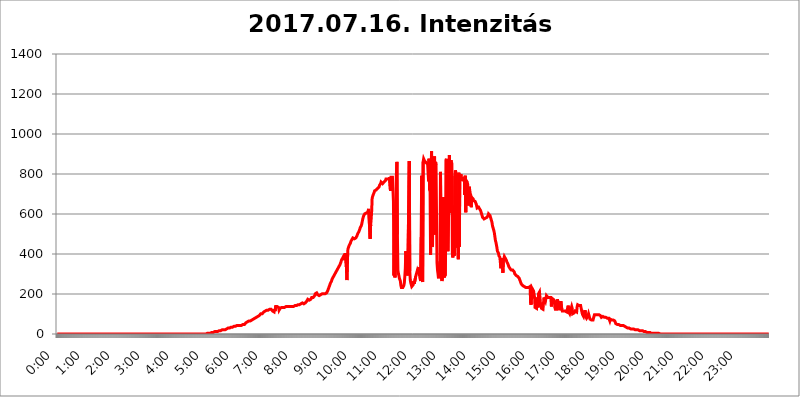
| Category | 2017.07.16. Intenzitás [W/m^2]04 |
|---|---|
| 0.0 | 0 |
| 0.0006944444444444445 | 0 |
| 0.001388888888888889 | 0 |
| 0.0020833333333333333 | 0 |
| 0.002777777777777778 | 0 |
| 0.003472222222222222 | 0 |
| 0.004166666666666667 | 0 |
| 0.004861111111111111 | 0 |
| 0.005555555555555556 | 0 |
| 0.0062499999999999995 | 0 |
| 0.006944444444444444 | 0 |
| 0.007638888888888889 | 0 |
| 0.008333333333333333 | 0 |
| 0.009027777777777779 | 0 |
| 0.009722222222222222 | 0 |
| 0.010416666666666666 | 0 |
| 0.011111111111111112 | 0 |
| 0.011805555555555555 | 0 |
| 0.012499999999999999 | 0 |
| 0.013194444444444444 | 0 |
| 0.013888888888888888 | 0 |
| 0.014583333333333332 | 0 |
| 0.015277777777777777 | 0 |
| 0.015972222222222224 | 0 |
| 0.016666666666666666 | 0 |
| 0.017361111111111112 | 0 |
| 0.018055555555555557 | 0 |
| 0.01875 | 0 |
| 0.019444444444444445 | 0 |
| 0.02013888888888889 | 0 |
| 0.020833333333333332 | 0 |
| 0.02152777777777778 | 0 |
| 0.022222222222222223 | 0 |
| 0.02291666666666667 | 0 |
| 0.02361111111111111 | 0 |
| 0.024305555555555556 | 0 |
| 0.024999999999999998 | 0 |
| 0.025694444444444447 | 0 |
| 0.02638888888888889 | 0 |
| 0.027083333333333334 | 0 |
| 0.027777777777777776 | 0 |
| 0.02847222222222222 | 0 |
| 0.029166666666666664 | 0 |
| 0.029861111111111113 | 0 |
| 0.030555555555555555 | 0 |
| 0.03125 | 0 |
| 0.03194444444444445 | 0 |
| 0.03263888888888889 | 0 |
| 0.03333333333333333 | 0 |
| 0.034027777777777775 | 0 |
| 0.034722222222222224 | 0 |
| 0.035416666666666666 | 0 |
| 0.036111111111111115 | 0 |
| 0.03680555555555556 | 0 |
| 0.0375 | 0 |
| 0.03819444444444444 | 0 |
| 0.03888888888888889 | 0 |
| 0.03958333333333333 | 0 |
| 0.04027777777777778 | 0 |
| 0.04097222222222222 | 0 |
| 0.041666666666666664 | 0 |
| 0.042361111111111106 | 0 |
| 0.04305555555555556 | 0 |
| 0.043750000000000004 | 0 |
| 0.044444444444444446 | 0 |
| 0.04513888888888889 | 0 |
| 0.04583333333333334 | 0 |
| 0.04652777777777778 | 0 |
| 0.04722222222222222 | 0 |
| 0.04791666666666666 | 0 |
| 0.04861111111111111 | 0 |
| 0.049305555555555554 | 0 |
| 0.049999999999999996 | 0 |
| 0.05069444444444445 | 0 |
| 0.051388888888888894 | 0 |
| 0.052083333333333336 | 0 |
| 0.05277777777777778 | 0 |
| 0.05347222222222222 | 0 |
| 0.05416666666666667 | 0 |
| 0.05486111111111111 | 0 |
| 0.05555555555555555 | 0 |
| 0.05625 | 0 |
| 0.05694444444444444 | 0 |
| 0.057638888888888885 | 0 |
| 0.05833333333333333 | 0 |
| 0.05902777777777778 | 0 |
| 0.059722222222222225 | 0 |
| 0.06041666666666667 | 0 |
| 0.061111111111111116 | 0 |
| 0.06180555555555556 | 0 |
| 0.0625 | 0 |
| 0.06319444444444444 | 0 |
| 0.06388888888888888 | 0 |
| 0.06458333333333334 | 0 |
| 0.06527777777777778 | 0 |
| 0.06597222222222222 | 0 |
| 0.06666666666666667 | 0 |
| 0.06736111111111111 | 0 |
| 0.06805555555555555 | 0 |
| 0.06874999999999999 | 0 |
| 0.06944444444444443 | 0 |
| 0.07013888888888889 | 0 |
| 0.07083333333333333 | 0 |
| 0.07152777777777779 | 0 |
| 0.07222222222222223 | 0 |
| 0.07291666666666667 | 0 |
| 0.07361111111111111 | 0 |
| 0.07430555555555556 | 0 |
| 0.075 | 0 |
| 0.07569444444444444 | 0 |
| 0.0763888888888889 | 0 |
| 0.07708333333333334 | 0 |
| 0.07777777777777778 | 0 |
| 0.07847222222222222 | 0 |
| 0.07916666666666666 | 0 |
| 0.0798611111111111 | 0 |
| 0.08055555555555556 | 0 |
| 0.08125 | 0 |
| 0.08194444444444444 | 0 |
| 0.08263888888888889 | 0 |
| 0.08333333333333333 | 0 |
| 0.08402777777777777 | 0 |
| 0.08472222222222221 | 0 |
| 0.08541666666666665 | 0 |
| 0.08611111111111112 | 0 |
| 0.08680555555555557 | 0 |
| 0.08750000000000001 | 0 |
| 0.08819444444444445 | 0 |
| 0.08888888888888889 | 0 |
| 0.08958333333333333 | 0 |
| 0.09027777777777778 | 0 |
| 0.09097222222222222 | 0 |
| 0.09166666666666667 | 0 |
| 0.09236111111111112 | 0 |
| 0.09305555555555556 | 0 |
| 0.09375 | 0 |
| 0.09444444444444444 | 0 |
| 0.09513888888888888 | 0 |
| 0.09583333333333333 | 0 |
| 0.09652777777777777 | 0 |
| 0.09722222222222222 | 0 |
| 0.09791666666666667 | 0 |
| 0.09861111111111111 | 0 |
| 0.09930555555555555 | 0 |
| 0.09999999999999999 | 0 |
| 0.10069444444444443 | 0 |
| 0.1013888888888889 | 0 |
| 0.10208333333333335 | 0 |
| 0.10277777777777779 | 0 |
| 0.10347222222222223 | 0 |
| 0.10416666666666667 | 0 |
| 0.10486111111111111 | 0 |
| 0.10555555555555556 | 0 |
| 0.10625 | 0 |
| 0.10694444444444444 | 0 |
| 0.1076388888888889 | 0 |
| 0.10833333333333334 | 0 |
| 0.10902777777777778 | 0 |
| 0.10972222222222222 | 0 |
| 0.1111111111111111 | 0 |
| 0.11180555555555556 | 0 |
| 0.11180555555555556 | 0 |
| 0.1125 | 0 |
| 0.11319444444444444 | 0 |
| 0.11388888888888889 | 0 |
| 0.11458333333333333 | 0 |
| 0.11527777777777777 | 0 |
| 0.11597222222222221 | 0 |
| 0.11666666666666665 | 0 |
| 0.1173611111111111 | 0 |
| 0.11805555555555557 | 0 |
| 0.11944444444444445 | 0 |
| 0.12013888888888889 | 0 |
| 0.12083333333333333 | 0 |
| 0.12152777777777778 | 0 |
| 0.12222222222222223 | 0 |
| 0.12291666666666667 | 0 |
| 0.12291666666666667 | 0 |
| 0.12361111111111112 | 0 |
| 0.12430555555555556 | 0 |
| 0.125 | 0 |
| 0.12569444444444444 | 0 |
| 0.12638888888888888 | 0 |
| 0.12708333333333333 | 0 |
| 0.16875 | 0 |
| 0.12847222222222224 | 0 |
| 0.12916666666666668 | 0 |
| 0.12986111111111112 | 0 |
| 0.13055555555555556 | 0 |
| 0.13125 | 0 |
| 0.13194444444444445 | 0 |
| 0.1326388888888889 | 0 |
| 0.13333333333333333 | 0 |
| 0.13402777777777777 | 0 |
| 0.13402777777777777 | 0 |
| 0.13472222222222222 | 0 |
| 0.13541666666666666 | 0 |
| 0.1361111111111111 | 0 |
| 0.13749999999999998 | 0 |
| 0.13819444444444443 | 0 |
| 0.1388888888888889 | 0 |
| 0.13958333333333334 | 0 |
| 0.14027777777777778 | 0 |
| 0.14097222222222222 | 0 |
| 0.14166666666666666 | 0 |
| 0.1423611111111111 | 0 |
| 0.14305555555555557 | 0 |
| 0.14375000000000002 | 0 |
| 0.14444444444444446 | 0 |
| 0.1451388888888889 | 0 |
| 0.1451388888888889 | 0 |
| 0.14652777777777778 | 0 |
| 0.14722222222222223 | 0 |
| 0.14791666666666667 | 0 |
| 0.1486111111111111 | 0 |
| 0.14930555555555555 | 0 |
| 0.15 | 0 |
| 0.15069444444444444 | 0 |
| 0.15138888888888888 | 0 |
| 0.15208333333333332 | 0 |
| 0.15277777777777776 | 0 |
| 0.15347222222222223 | 0 |
| 0.15416666666666667 | 0 |
| 0.15486111111111112 | 0 |
| 0.15555555555555556 | 0 |
| 0.15625 | 0 |
| 0.15694444444444444 | 0 |
| 0.15763888888888888 | 0 |
| 0.15833333333333333 | 0 |
| 0.15902777777777777 | 0 |
| 0.15972222222222224 | 0 |
| 0.16041666666666668 | 0 |
| 0.16111111111111112 | 0 |
| 0.16180555555555556 | 0 |
| 0.1625 | 0 |
| 0.16319444444444445 | 0 |
| 0.1638888888888889 | 0 |
| 0.16458333333333333 | 0 |
| 0.16527777777777777 | 0 |
| 0.16597222222222222 | 0 |
| 0.16666666666666666 | 0 |
| 0.1673611111111111 | 0 |
| 0.16805555555555554 | 0 |
| 0.16874999999999998 | 0 |
| 0.16944444444444443 | 0 |
| 0.17013888888888887 | 0 |
| 0.1708333333333333 | 0 |
| 0.17152777777777775 | 0 |
| 0.17222222222222225 | 0 |
| 0.1729166666666667 | 0 |
| 0.17361111111111113 | 0 |
| 0.17430555555555557 | 0 |
| 0.17500000000000002 | 0 |
| 0.17569444444444446 | 0 |
| 0.1763888888888889 | 0 |
| 0.17708333333333334 | 0 |
| 0.17777777777777778 | 0 |
| 0.17847222222222223 | 0 |
| 0.17916666666666667 | 0 |
| 0.1798611111111111 | 0 |
| 0.18055555555555555 | 0 |
| 0.18125 | 0 |
| 0.18194444444444444 | 0 |
| 0.1826388888888889 | 0 |
| 0.18333333333333335 | 0 |
| 0.1840277777777778 | 0 |
| 0.18472222222222223 | 0 |
| 0.18541666666666667 | 0 |
| 0.18611111111111112 | 0 |
| 0.18680555555555556 | 0 |
| 0.1875 | 0 |
| 0.18819444444444444 | 0 |
| 0.18888888888888888 | 0 |
| 0.18958333333333333 | 0 |
| 0.19027777777777777 | 0 |
| 0.1909722222222222 | 0 |
| 0.19166666666666665 | 0 |
| 0.19236111111111112 | 0 |
| 0.19305555555555554 | 0 |
| 0.19375 | 0 |
| 0.19444444444444445 | 0 |
| 0.1951388888888889 | 0 |
| 0.19583333333333333 | 0 |
| 0.19652777777777777 | 0 |
| 0.19722222222222222 | 0 |
| 0.19791666666666666 | 0 |
| 0.1986111111111111 | 0 |
| 0.19930555555555554 | 0 |
| 0.19999999999999998 | 0 |
| 0.20069444444444443 | 0 |
| 0.20138888888888887 | 0 |
| 0.2020833333333333 | 0 |
| 0.2027777777777778 | 0 |
| 0.2034722222222222 | 0 |
| 0.2041666666666667 | 0 |
| 0.20486111111111113 | 0 |
| 0.20555555555555557 | 0 |
| 0.20625000000000002 | 0 |
| 0.20694444444444446 | 0 |
| 0.2076388888888889 | 0 |
| 0.20833333333333334 | 0 |
| 0.20902777777777778 | 3.525 |
| 0.20972222222222223 | 3.525 |
| 0.21041666666666667 | 3.525 |
| 0.2111111111111111 | 3.525 |
| 0.21180555555555555 | 3.525 |
| 0.2125 | 3.525 |
| 0.21319444444444444 | 3.525 |
| 0.2138888888888889 | 3.525 |
| 0.21458333333333335 | 3.525 |
| 0.2152777777777778 | 3.525 |
| 0.21597222222222223 | 3.525 |
| 0.21666666666666667 | 7.887 |
| 0.21736111111111112 | 7.887 |
| 0.21805555555555556 | 7.887 |
| 0.21875 | 7.887 |
| 0.21944444444444444 | 7.887 |
| 0.22013888888888888 | 7.887 |
| 0.22083333333333333 | 12.257 |
| 0.22152777777777777 | 12.257 |
| 0.2222222222222222 | 12.257 |
| 0.22291666666666665 | 12.257 |
| 0.2236111111111111 | 12.257 |
| 0.22430555555555556 | 12.257 |
| 0.225 | 12.257 |
| 0.22569444444444445 | 12.257 |
| 0.2263888888888889 | 12.257 |
| 0.22708333333333333 | 16.636 |
| 0.22777777777777777 | 16.636 |
| 0.22847222222222222 | 16.636 |
| 0.22916666666666666 | 16.636 |
| 0.2298611111111111 | 16.636 |
| 0.23055555555555554 | 16.636 |
| 0.23124999999999998 | 21.024 |
| 0.23194444444444443 | 21.024 |
| 0.23263888888888887 | 21.024 |
| 0.2333333333333333 | 21.024 |
| 0.2340277777777778 | 21.024 |
| 0.2347222222222222 | 21.024 |
| 0.2354166666666667 | 21.024 |
| 0.23611111111111113 | 21.024 |
| 0.23680555555555557 | 21.024 |
| 0.23750000000000002 | 25.419 |
| 0.23819444444444446 | 25.419 |
| 0.2388888888888889 | 25.419 |
| 0.23958333333333334 | 29.823 |
| 0.24027777777777778 | 29.823 |
| 0.24097222222222223 | 29.823 |
| 0.24166666666666667 | 29.823 |
| 0.2423611111111111 | 34.234 |
| 0.24305555555555555 | 34.234 |
| 0.24375 | 34.234 |
| 0.24444444444444446 | 34.234 |
| 0.24513888888888888 | 34.234 |
| 0.24583333333333335 | 34.234 |
| 0.2465277777777778 | 38.653 |
| 0.24722222222222223 | 38.653 |
| 0.24791666666666667 | 38.653 |
| 0.24861111111111112 | 38.653 |
| 0.24930555555555556 | 38.653 |
| 0.25 | 38.653 |
| 0.25069444444444444 | 43.079 |
| 0.2513888888888889 | 43.079 |
| 0.2520833333333333 | 43.079 |
| 0.25277777777777777 | 43.079 |
| 0.2534722222222222 | 43.079 |
| 0.25416666666666665 | 43.079 |
| 0.2548611111111111 | 43.079 |
| 0.2555555555555556 | 43.079 |
| 0.25625000000000003 | 43.079 |
| 0.2569444444444445 | 43.079 |
| 0.2576388888888889 | 43.079 |
| 0.25833333333333336 | 43.079 |
| 0.2590277777777778 | 47.511 |
| 0.25972222222222224 | 47.511 |
| 0.2604166666666667 | 47.511 |
| 0.2611111111111111 | 47.511 |
| 0.26180555555555557 | 47.511 |
| 0.2625 | 47.511 |
| 0.26319444444444445 | 51.951 |
| 0.2638888888888889 | 51.951 |
| 0.26458333333333334 | 56.398 |
| 0.2652777777777778 | 56.398 |
| 0.2659722222222222 | 60.85 |
| 0.26666666666666666 | 60.85 |
| 0.2673611111111111 | 65.31 |
| 0.26805555555555555 | 65.31 |
| 0.26875 | 65.31 |
| 0.26944444444444443 | 65.31 |
| 0.2701388888888889 | 65.31 |
| 0.2708333333333333 | 65.31 |
| 0.27152777777777776 | 65.31 |
| 0.2722222222222222 | 69.775 |
| 0.27291666666666664 | 69.775 |
| 0.2736111111111111 | 69.775 |
| 0.2743055555555555 | 74.246 |
| 0.27499999999999997 | 74.246 |
| 0.27569444444444446 | 74.246 |
| 0.27638888888888885 | 78.722 |
| 0.27708333333333335 | 78.722 |
| 0.2777777777777778 | 78.722 |
| 0.27847222222222223 | 83.205 |
| 0.2791666666666667 | 83.205 |
| 0.2798611111111111 | 83.205 |
| 0.28055555555555556 | 83.205 |
| 0.28125 | 87.692 |
| 0.28194444444444444 | 92.184 |
| 0.2826388888888889 | 92.184 |
| 0.2833333333333333 | 92.184 |
| 0.28402777777777777 | 96.682 |
| 0.2847222222222222 | 96.682 |
| 0.28541666666666665 | 101.184 |
| 0.28611111111111115 | 101.184 |
| 0.28680555555555554 | 101.184 |
| 0.28750000000000003 | 101.184 |
| 0.2881944444444445 | 101.184 |
| 0.2888888888888889 | 105.69 |
| 0.28958333333333336 | 110.201 |
| 0.2902777777777778 | 110.201 |
| 0.29097222222222224 | 110.201 |
| 0.2916666666666667 | 114.716 |
| 0.2923611111111111 | 114.716 |
| 0.29305555555555557 | 119.235 |
| 0.29375 | 119.235 |
| 0.29444444444444445 | 119.235 |
| 0.2951388888888889 | 119.235 |
| 0.29583333333333334 | 119.235 |
| 0.2965277777777778 | 123.758 |
| 0.2972222222222222 | 119.235 |
| 0.29791666666666666 | 123.758 |
| 0.2986111111111111 | 123.758 |
| 0.29930555555555555 | 123.758 |
| 0.3 | 123.758 |
| 0.30069444444444443 | 123.758 |
| 0.3013888888888889 | 119.235 |
| 0.3020833333333333 | 114.716 |
| 0.30277777777777776 | 114.716 |
| 0.3034722222222222 | 114.716 |
| 0.30416666666666664 | 110.201 |
| 0.3048611111111111 | 123.758 |
| 0.3055555555555555 | 114.716 |
| 0.30624999999999997 | 137.347 |
| 0.3069444444444444 | 132.814 |
| 0.3076388888888889 | 137.347 |
| 0.30833333333333335 | 137.347 |
| 0.3090277777777778 | 137.347 |
| 0.30972222222222223 | 137.347 |
| 0.3104166666666667 | 132.814 |
| 0.3111111111111111 | 119.235 |
| 0.31180555555555556 | 119.235 |
| 0.3125 | 128.284 |
| 0.31319444444444444 | 132.814 |
| 0.3138888888888889 | 132.814 |
| 0.3145833333333333 | 132.814 |
| 0.31527777777777777 | 132.814 |
| 0.3159722222222222 | 132.814 |
| 0.31666666666666665 | 132.814 |
| 0.31736111111111115 | 132.814 |
| 0.31805555555555554 | 132.814 |
| 0.31875000000000003 | 132.814 |
| 0.3194444444444445 | 132.814 |
| 0.3201388888888889 | 137.347 |
| 0.32083333333333336 | 137.347 |
| 0.3215277777777778 | 137.347 |
| 0.32222222222222224 | 137.347 |
| 0.3229166666666667 | 137.347 |
| 0.3236111111111111 | 137.347 |
| 0.32430555555555557 | 137.347 |
| 0.325 | 137.347 |
| 0.32569444444444445 | 137.347 |
| 0.3263888888888889 | 137.347 |
| 0.32708333333333334 | 137.347 |
| 0.3277777777777778 | 137.347 |
| 0.3284722222222222 | 137.347 |
| 0.32916666666666666 | 137.347 |
| 0.3298611111111111 | 137.347 |
| 0.33055555555555555 | 137.347 |
| 0.33125 | 137.347 |
| 0.33194444444444443 | 137.347 |
| 0.3326388888888889 | 141.884 |
| 0.3333333333333333 | 141.884 |
| 0.3340277777777778 | 141.884 |
| 0.3347222222222222 | 141.884 |
| 0.3354166666666667 | 141.884 |
| 0.3361111111111111 | 141.884 |
| 0.3368055555555556 | 141.884 |
| 0.33749999999999997 | 146.423 |
| 0.33819444444444446 | 146.423 |
| 0.33888888888888885 | 146.423 |
| 0.33958333333333335 | 146.423 |
| 0.34027777777777773 | 146.423 |
| 0.34097222222222223 | 146.423 |
| 0.3416666666666666 | 150.964 |
| 0.3423611111111111 | 150.964 |
| 0.3430555555555555 | 150.964 |
| 0.34375 | 155.509 |
| 0.3444444444444445 | 155.509 |
| 0.3451388888888889 | 155.509 |
| 0.3458333333333334 | 150.964 |
| 0.34652777777777777 | 150.964 |
| 0.34722222222222227 | 150.964 |
| 0.34791666666666665 | 155.509 |
| 0.34861111111111115 | 160.056 |
| 0.34930555555555554 | 160.056 |
| 0.35000000000000003 | 164.605 |
| 0.3506944444444444 | 169.156 |
| 0.3513888888888889 | 173.709 |
| 0.3520833333333333 | 173.709 |
| 0.3527777777777778 | 169.156 |
| 0.3534722222222222 | 169.156 |
| 0.3541666666666667 | 169.156 |
| 0.3548611111111111 | 173.709 |
| 0.35555555555555557 | 173.709 |
| 0.35625 | 178.264 |
| 0.35694444444444445 | 182.82 |
| 0.3576388888888889 | 182.82 |
| 0.35833333333333334 | 182.82 |
| 0.3590277777777778 | 182.82 |
| 0.3597222222222222 | 182.82 |
| 0.36041666666666666 | 187.378 |
| 0.3611111111111111 | 191.937 |
| 0.36180555555555555 | 201.058 |
| 0.3625 | 205.62 |
| 0.36319444444444443 | 205.62 |
| 0.3638888888888889 | 205.62 |
| 0.3645833333333333 | 201.058 |
| 0.3652777777777778 | 196.497 |
| 0.3659722222222222 | 191.937 |
| 0.3666666666666667 | 191.937 |
| 0.3673611111111111 | 191.937 |
| 0.3680555555555556 | 191.937 |
| 0.36874999999999997 | 191.937 |
| 0.36944444444444446 | 196.497 |
| 0.37013888888888885 | 196.497 |
| 0.37083333333333335 | 201.058 |
| 0.37152777777777773 | 201.058 |
| 0.37222222222222223 | 201.058 |
| 0.3729166666666666 | 201.058 |
| 0.3736111111111111 | 201.058 |
| 0.3743055555555555 | 201.058 |
| 0.375 | 201.058 |
| 0.3756944444444445 | 201.058 |
| 0.3763888888888889 | 201.058 |
| 0.3770833333333334 | 201.058 |
| 0.37777777777777777 | 205.62 |
| 0.37847222222222227 | 210.182 |
| 0.37916666666666665 | 214.746 |
| 0.37986111111111115 | 219.309 |
| 0.38055555555555554 | 228.436 |
| 0.38125000000000003 | 233 |
| 0.3819444444444444 | 242.127 |
| 0.3826388888888889 | 246.689 |
| 0.3833333333333333 | 255.813 |
| 0.3840277777777778 | 260.373 |
| 0.3847222222222222 | 264.932 |
| 0.3854166666666667 | 274.047 |
| 0.3861111111111111 | 278.603 |
| 0.38680555555555557 | 283.156 |
| 0.3875 | 287.709 |
| 0.38819444444444445 | 292.259 |
| 0.3888888888888889 | 296.808 |
| 0.38958333333333334 | 301.354 |
| 0.3902777777777778 | 305.898 |
| 0.3909722222222222 | 310.44 |
| 0.39166666666666666 | 314.98 |
| 0.3923611111111111 | 319.517 |
| 0.39305555555555555 | 324.052 |
| 0.39375 | 328.584 |
| 0.39444444444444443 | 333.113 |
| 0.3951388888888889 | 337.639 |
| 0.3958333333333333 | 342.162 |
| 0.3965277777777778 | 346.682 |
| 0.3972222222222222 | 351.198 |
| 0.3979166666666667 | 360.221 |
| 0.3986111111111111 | 369.23 |
| 0.3993055555555556 | 373.729 |
| 0.39999999999999997 | 378.224 |
| 0.40069444444444446 | 382.715 |
| 0.40138888888888885 | 387.202 |
| 0.40208333333333335 | 387.202 |
| 0.40277777777777773 | 391.685 |
| 0.40347222222222223 | 369.23 |
| 0.4041666666666666 | 405.108 |
| 0.4048611111111111 | 400.638 |
| 0.4055555555555555 | 333.113 |
| 0.40625 | 269.49 |
| 0.4069444444444445 | 355.712 |
| 0.4076388888888889 | 422.943 |
| 0.4083333333333334 | 431.833 |
| 0.40902777777777777 | 436.27 |
| 0.40972222222222227 | 445.129 |
| 0.41041666666666665 | 449.551 |
| 0.41111111111111115 | 453.968 |
| 0.41180555555555554 | 462.786 |
| 0.41250000000000003 | 467.187 |
| 0.4131944444444444 | 471.582 |
| 0.4138888888888889 | 475.972 |
| 0.4145833333333333 | 480.356 |
| 0.4152777777777778 | 475.972 |
| 0.4159722222222222 | 475.972 |
| 0.4166666666666667 | 475.972 |
| 0.4173611111111111 | 475.972 |
| 0.41805555555555557 | 475.972 |
| 0.41875 | 480.356 |
| 0.41944444444444445 | 484.735 |
| 0.4201388888888889 | 489.108 |
| 0.42083333333333334 | 493.475 |
| 0.4215277777777778 | 502.192 |
| 0.4222222222222222 | 506.542 |
| 0.42291666666666666 | 510.885 |
| 0.4236111111111111 | 515.223 |
| 0.42430555555555555 | 523.88 |
| 0.425 | 532.513 |
| 0.42569444444444443 | 536.82 |
| 0.4263888888888889 | 541.121 |
| 0.4270833333333333 | 549.704 |
| 0.4277777777777778 | 562.53 |
| 0.4284722222222222 | 575.299 |
| 0.4291666666666667 | 579.542 |
| 0.4298611111111111 | 592.233 |
| 0.4305555555555556 | 596.45 |
| 0.43124999999999997 | 600.661 |
| 0.43194444444444446 | 600.661 |
| 0.43263888888888885 | 604.864 |
| 0.43333333333333335 | 604.864 |
| 0.43402777777777773 | 604.864 |
| 0.43472222222222223 | 609.062 |
| 0.4354166666666666 | 609.062 |
| 0.4361111111111111 | 617.436 |
| 0.4368055555555555 | 625.784 |
| 0.4375 | 625.784 |
| 0.4381944444444445 | 629.948 |
| 0.4388888888888889 | 475.972 |
| 0.4395833333333334 | 545.416 |
| 0.44027777777777777 | 575.299 |
| 0.44097222222222227 | 613.252 |
| 0.44166666666666665 | 679.395 |
| 0.44236111111111115 | 683.473 |
| 0.44305555555555554 | 695.666 |
| 0.44375000000000003 | 691.608 |
| 0.4444444444444444 | 707.8 |
| 0.4451388888888889 | 715.858 |
| 0.4458333333333333 | 719.877 |
| 0.4465277777777778 | 719.877 |
| 0.4472222222222222 | 719.877 |
| 0.4479166666666667 | 723.889 |
| 0.4486111111111111 | 723.889 |
| 0.44930555555555557 | 727.896 |
| 0.45 | 727.896 |
| 0.45069444444444445 | 731.896 |
| 0.4513888888888889 | 735.89 |
| 0.45208333333333334 | 743.859 |
| 0.4527777777777778 | 747.834 |
| 0.4534722222222222 | 751.803 |
| 0.45416666666666666 | 759.723 |
| 0.4548611111111111 | 755.766 |
| 0.45555555555555555 | 755.766 |
| 0.45625 | 751.803 |
| 0.45694444444444443 | 747.834 |
| 0.4576388888888889 | 751.803 |
| 0.4583333333333333 | 759.723 |
| 0.4590277777777778 | 755.766 |
| 0.4597222222222222 | 759.723 |
| 0.4604166666666667 | 767.62 |
| 0.4611111111111111 | 775.492 |
| 0.4618055555555556 | 775.492 |
| 0.46249999999999997 | 775.492 |
| 0.46319444444444446 | 775.492 |
| 0.46388888888888885 | 771.559 |
| 0.46458333333333335 | 771.559 |
| 0.46527777777777773 | 775.492 |
| 0.46597222222222223 | 783.342 |
| 0.4666666666666666 | 787.258 |
| 0.4673611111111111 | 715.858 |
| 0.4680555555555555 | 783.342 |
| 0.46875 | 783.342 |
| 0.4694444444444445 | 783.342 |
| 0.4701388888888889 | 783.342 |
| 0.4708333333333334 | 787.258 |
| 0.47152777777777777 | 663.019 |
| 0.47222222222222227 | 292.259 |
| 0.47291666666666665 | 553.986 |
| 0.47361111111111115 | 283.156 |
| 0.47430555555555554 | 360.221 |
| 0.47500000000000003 | 328.584 |
| 0.4756944444444444 | 798.974 |
| 0.4763888888888889 | 860.676 |
| 0.4770833333333333 | 497.836 |
| 0.4777777777777778 | 319.517 |
| 0.4784722222222222 | 301.354 |
| 0.4791666666666667 | 292.259 |
| 0.4798611111111111 | 278.603 |
| 0.48055555555555557 | 278.603 |
| 0.48125 | 264.932 |
| 0.48194444444444445 | 242.127 |
| 0.4826388888888889 | 233 |
| 0.48333333333333334 | 228.436 |
| 0.4840277777777778 | 228.436 |
| 0.4847222222222222 | 233 |
| 0.48541666666666666 | 233 |
| 0.4861111111111111 | 242.127 |
| 0.48680555555555555 | 255.813 |
| 0.4875 | 287.709 |
| 0.48819444444444443 | 328.584 |
| 0.4888888888888889 | 414.035 |
| 0.4895833333333333 | 333.113 |
| 0.4902777777777778 | 314.98 |
| 0.4909722222222222 | 301.354 |
| 0.4916666666666667 | 292.259 |
| 0.4923611111111111 | 287.709 |
| 0.4930555555555556 | 296.808 |
| 0.49374999999999997 | 864.493 |
| 0.49444444444444446 | 314.98 |
| 0.49513888888888885 | 269.49 |
| 0.49583333333333335 | 255.813 |
| 0.49652777777777773 | 246.689 |
| 0.49722222222222223 | 237.564 |
| 0.4979166666666666 | 233 |
| 0.4986111111111111 | 237.564 |
| 0.4993055555555555 | 246.689 |
| 0.5 | 264.932 |
| 0.5006944444444444 | 251.251 |
| 0.5013888888888889 | 251.251 |
| 0.5020833333333333 | 255.813 |
| 0.5027777777777778 | 287.709 |
| 0.5034722222222222 | 296.808 |
| 0.5041666666666667 | 305.898 |
| 0.5048611111111111 | 314.98 |
| 0.5055555555555555 | 305.898 |
| 0.50625 | 305.898 |
| 0.5069444444444444 | 333.113 |
| 0.5076388888888889 | 305.898 |
| 0.5083333333333333 | 287.709 |
| 0.5090277777777777 | 274.047 |
| 0.5097222222222222 | 264.932 |
| 0.5104166666666666 | 484.735 |
| 0.5111111111111112 | 791.169 |
| 0.5118055555555555 | 274.047 |
| 0.5125000000000001 | 260.373 |
| 0.5131944444444444 | 860.676 |
| 0.513888888888889 | 875.918 |
| 0.5145833333333333 | 872.114 |
| 0.5152777777777778 | 864.493 |
| 0.5159722222222222 | 864.493 |
| 0.5166666666666667 | 860.676 |
| 0.517361111111111 | 856.855 |
| 0.5180555555555556 | 853.029 |
| 0.5187499999999999 | 853.029 |
| 0.5194444444444445 | 849.199 |
| 0.5201388888888888 | 849.199 |
| 0.5208333333333334 | 763.674 |
| 0.5215277777777778 | 875.918 |
| 0.5222222222222223 | 719.877 |
| 0.5229166666666667 | 711.832 |
| 0.5236111111111111 | 396.164 |
| 0.5243055555555556 | 818.392 |
| 0.525 | 913.766 |
| 0.5256944444444445 | 436.27 |
| 0.5263888888888889 | 445.129 |
| 0.5270833333333333 | 822.26 |
| 0.5277777777777778 | 860.676 |
| 0.5284722222222222 | 802.868 |
| 0.5291666666666667 | 887.309 |
| 0.5298611111111111 | 497.836 |
| 0.5305555555555556 | 860.676 |
| 0.53125 | 845.365 |
| 0.5319444444444444 | 596.45 |
| 0.5326388888888889 | 355.712 |
| 0.5333333333333333 | 319.517 |
| 0.5340277777777778 | 301.354 |
| 0.5347222222222222 | 278.603 |
| 0.5354166666666667 | 274.047 |
| 0.5361111111111111 | 283.156 |
| 0.5368055555555555 | 364.728 |
| 0.5375 | 810.641 |
| 0.5381944444444444 | 506.542 |
| 0.5388888888888889 | 278.603 |
| 0.5395833333333333 | 264.932 |
| 0.5402777777777777 | 264.932 |
| 0.5409722222222222 | 296.808 |
| 0.5416666666666666 | 683.473 |
| 0.5423611111111112 | 283.156 |
| 0.5430555555555555 | 283.156 |
| 0.5437500000000001 | 287.709 |
| 0.5444444444444444 | 296.808 |
| 0.545138888888889 | 868.305 |
| 0.5458333333333333 | 875.918 |
| 0.5465277777777778 | 814.519 |
| 0.5472222222222222 | 583.779 |
| 0.5479166666666667 | 414.035 |
| 0.548611111111111 | 414.035 |
| 0.5493055555555556 | 691.608 |
| 0.5499999999999999 | 894.885 |
| 0.5506944444444445 | 679.395 |
| 0.5513888888888888 | 604.864 |
| 0.5520833333333334 | 868.305 |
| 0.5527777777777778 | 860.676 |
| 0.5534722222222223 | 853.029 |
| 0.5541666666666667 | 405.108 |
| 0.5548611111111111 | 382.715 |
| 0.5555555555555556 | 642.4 |
| 0.55625 | 405.108 |
| 0.5569444444444445 | 391.685 |
| 0.5576388888888889 | 791.169 |
| 0.5583333333333333 | 818.392 |
| 0.5590277777777778 | 806.757 |
| 0.5597222222222222 | 791.169 |
| 0.5604166666666667 | 431.833 |
| 0.5611111111111111 | 699.717 |
| 0.5618055555555556 | 440.702 |
| 0.5625 | 373.729 |
| 0.5631944444444444 | 806.757 |
| 0.5638888888888889 | 436.27 |
| 0.5645833333333333 | 775.492 |
| 0.5652777777777778 | 767.62 |
| 0.5659722222222222 | 798.974 |
| 0.5666666666666667 | 779.42 |
| 0.5673611111111111 | 771.559 |
| 0.5680555555555555 | 771.559 |
| 0.56875 | 771.559 |
| 0.5694444444444444 | 771.559 |
| 0.5701388888888889 | 775.492 |
| 0.5708333333333333 | 783.342 |
| 0.5715277777777777 | 695.666 |
| 0.5722222222222222 | 791.169 |
| 0.5729166666666666 | 609.062 |
| 0.5736111111111112 | 767.62 |
| 0.5743055555555555 | 763.674 |
| 0.5750000000000001 | 759.723 |
| 0.5756944444444444 | 747.834 |
| 0.576388888888889 | 747.834 |
| 0.5770833333333333 | 642.4 |
| 0.5777777777777778 | 735.89 |
| 0.5784722222222222 | 719.877 |
| 0.5791666666666667 | 703.762 |
| 0.579861111111111 | 695.666 |
| 0.5805555555555556 | 634.105 |
| 0.5812499999999999 | 683.473 |
| 0.5819444444444445 | 683.473 |
| 0.5826388888888888 | 679.395 |
| 0.5833333333333334 | 675.311 |
| 0.5840277777777778 | 667.123 |
| 0.5847222222222223 | 667.123 |
| 0.5854166666666667 | 667.123 |
| 0.5861111111111111 | 663.019 |
| 0.5868055555555556 | 658.909 |
| 0.5875 | 650.667 |
| 0.5881944444444445 | 642.4 |
| 0.5888888888888889 | 629.948 |
| 0.5895833333333333 | 629.948 |
| 0.5902777777777778 | 634.105 |
| 0.5909722222222222 | 634.105 |
| 0.5916666666666667 | 629.948 |
| 0.5923611111111111 | 625.784 |
| 0.5930555555555556 | 629.948 |
| 0.59375 | 617.436 |
| 0.5944444444444444 | 609.062 |
| 0.5951388888888889 | 604.864 |
| 0.5958333333333333 | 592.233 |
| 0.5965277777777778 | 583.779 |
| 0.5972222222222222 | 583.779 |
| 0.5979166666666667 | 579.542 |
| 0.5986111111111111 | 575.299 |
| 0.5993055555555555 | 575.299 |
| 0.6 | 579.542 |
| 0.6006944444444444 | 579.542 |
| 0.6013888888888889 | 583.779 |
| 0.6020833333333333 | 583.779 |
| 0.6027777777777777 | 583.779 |
| 0.6034722222222222 | 583.779 |
| 0.6041666666666666 | 592.233 |
| 0.6048611111111112 | 600.661 |
| 0.6055555555555555 | 600.661 |
| 0.6062500000000001 | 600.661 |
| 0.6069444444444444 | 592.233 |
| 0.607638888888889 | 583.779 |
| 0.6083333333333333 | 575.299 |
| 0.6090277777777778 | 566.793 |
| 0.6097222222222222 | 558.261 |
| 0.6104166666666667 | 541.121 |
| 0.611111111111111 | 532.513 |
| 0.6118055555555556 | 523.88 |
| 0.6124999999999999 | 515.223 |
| 0.6131944444444445 | 502.192 |
| 0.6138888888888888 | 484.735 |
| 0.6145833333333334 | 467.187 |
| 0.6152777777777778 | 458.38 |
| 0.6159722222222223 | 445.129 |
| 0.6166666666666667 | 431.833 |
| 0.6173611111111111 | 414.035 |
| 0.6180555555555556 | 409.574 |
| 0.61875 | 405.108 |
| 0.6194444444444445 | 391.685 |
| 0.6201388888888889 | 387.202 |
| 0.6208333333333333 | 382.715 |
| 0.6215277777777778 | 382.715 |
| 0.6222222222222222 | 328.584 |
| 0.6229166666666667 | 378.224 |
| 0.6236111111111111 | 373.729 |
| 0.6243055555555556 | 337.639 |
| 0.625 | 305.898 |
| 0.6256944444444444 | 364.728 |
| 0.6263888888888889 | 360.221 |
| 0.6270833333333333 | 387.202 |
| 0.6277777777777778 | 382.715 |
| 0.6284722222222222 | 378.224 |
| 0.6291666666666667 | 373.729 |
| 0.6298611111111111 | 369.23 |
| 0.6305555555555555 | 360.221 |
| 0.63125 | 355.712 |
| 0.6319444444444444 | 351.198 |
| 0.6326388888888889 | 346.682 |
| 0.6333333333333333 | 337.639 |
| 0.6340277777777777 | 333.113 |
| 0.6347222222222222 | 328.584 |
| 0.6354166666666666 | 324.052 |
| 0.6361111111111112 | 324.052 |
| 0.6368055555555555 | 319.517 |
| 0.6375000000000001 | 324.052 |
| 0.6381944444444444 | 324.052 |
| 0.638888888888889 | 319.517 |
| 0.6395833333333333 | 319.517 |
| 0.6402777777777778 | 319.517 |
| 0.6409722222222222 | 310.44 |
| 0.6416666666666667 | 301.354 |
| 0.642361111111111 | 301.354 |
| 0.6430555555555556 | 296.808 |
| 0.6437499999999999 | 292.259 |
| 0.6444444444444445 | 287.709 |
| 0.6451388888888888 | 287.709 |
| 0.6458333333333334 | 287.709 |
| 0.6465277777777778 | 287.709 |
| 0.6472222222222223 | 283.156 |
| 0.6479166666666667 | 278.603 |
| 0.6486111111111111 | 274.047 |
| 0.6493055555555556 | 264.932 |
| 0.65 | 260.373 |
| 0.6506944444444445 | 251.251 |
| 0.6513888888888889 | 251.251 |
| 0.6520833333333333 | 246.689 |
| 0.6527777777777778 | 242.127 |
| 0.6534722222222222 | 242.127 |
| 0.6541666666666667 | 237.564 |
| 0.6548611111111111 | 237.564 |
| 0.6555555555555556 | 237.564 |
| 0.65625 | 237.564 |
| 0.6569444444444444 | 233 |
| 0.6576388888888889 | 233 |
| 0.6583333333333333 | 233 |
| 0.6590277777777778 | 233 |
| 0.6597222222222222 | 233 |
| 0.6604166666666667 | 233 |
| 0.6611111111111111 | 233 |
| 0.6618055555555555 | 233 |
| 0.6625 | 237.564 |
| 0.6631944444444444 | 237.564 |
| 0.6638888888888889 | 155.509 |
| 0.6645833333333333 | 146.423 |
| 0.6652777777777777 | 141.884 |
| 0.6659722222222222 | 228.436 |
| 0.6666666666666666 | 233 |
| 0.6673611111111111 | 228.436 |
| 0.6680555555555556 | 214.746 |
| 0.6687500000000001 | 214.746 |
| 0.6694444444444444 | 182.82 |
| 0.6701388888888888 | 132.814 |
| 0.6708333333333334 | 132.814 |
| 0.6715277777777778 | 128.284 |
| 0.6722222222222222 | 128.284 |
| 0.6729166666666666 | 182.82 |
| 0.6736111111111112 | 141.884 |
| 0.6743055555555556 | 132.814 |
| 0.6749999999999999 | 201.058 |
| 0.6756944444444444 | 205.62 |
| 0.6763888888888889 | 210.182 |
| 0.6770833333333334 | 210.182 |
| 0.6777777777777777 | 150.964 |
| 0.6784722222222223 | 150.964 |
| 0.6791666666666667 | 128.284 |
| 0.6798611111111111 | 123.758 |
| 0.6805555555555555 | 128.284 |
| 0.68125 | 123.758 |
| 0.6819444444444445 | 128.284 |
| 0.6826388888888889 | 182.82 |
| 0.6833333333333332 | 187.378 |
| 0.6840277777777778 | 182.82 |
| 0.6847222222222222 | 164.605 |
| 0.6854166666666667 | 160.056 |
| 0.686111111111111 | 191.937 |
| 0.6868055555555556 | 187.378 |
| 0.6875 | 187.378 |
| 0.6881944444444444 | 182.82 |
| 0.688888888888889 | 182.82 |
| 0.6895833333333333 | 182.82 |
| 0.6902777777777778 | 182.82 |
| 0.6909722222222222 | 182.82 |
| 0.6916666666666668 | 182.82 |
| 0.6923611111111111 | 182.82 |
| 0.6930555555555555 | 137.347 |
| 0.69375 | 178.264 |
| 0.6944444444444445 | 173.709 |
| 0.6951388888888889 | 173.709 |
| 0.6958333333333333 | 173.709 |
| 0.6965277777777777 | 178.264 |
| 0.6972222222222223 | 164.605 |
| 0.6979166666666666 | 132.814 |
| 0.6986111111111111 | 123.758 |
| 0.6993055555555556 | 123.758 |
| 0.7000000000000001 | 123.758 |
| 0.7006944444444444 | 123.758 |
| 0.7013888888888888 | 173.709 |
| 0.7020833333333334 | 173.709 |
| 0.7027777777777778 | 155.509 |
| 0.7034722222222222 | 132.814 |
| 0.7041666666666666 | 155.509 |
| 0.7048611111111112 | 119.235 |
| 0.7055555555555556 | 128.284 |
| 0.7062499999999999 | 164.605 |
| 0.7069444444444444 | 164.605 |
| 0.7076388888888889 | 123.758 |
| 0.7083333333333334 | 114.716 |
| 0.7090277777777777 | 114.716 |
| 0.7097222222222223 | 114.716 |
| 0.7104166666666667 | 114.716 |
| 0.7111111111111111 | 114.716 |
| 0.7118055555555555 | 114.716 |
| 0.7125 | 114.716 |
| 0.7131944444444445 | 114.716 |
| 0.7138888888888889 | 110.201 |
| 0.7145833333333332 | 110.201 |
| 0.7152777777777778 | 110.201 |
| 0.7159722222222222 | 110.201 |
| 0.7166666666666667 | 141.884 |
| 0.717361111111111 | 110.201 |
| 0.7180555555555556 | 105.69 |
| 0.71875 | 101.184 |
| 0.7194444444444444 | 101.184 |
| 0.720138888888889 | 101.184 |
| 0.7208333333333333 | 128.284 |
| 0.7215277777777778 | 137.347 |
| 0.7222222222222222 | 128.284 |
| 0.7229166666666668 | 101.184 |
| 0.7236111111111111 | 105.69 |
| 0.7243055555555555 | 105.69 |
| 0.725 | 105.69 |
| 0.7256944444444445 | 105.69 |
| 0.7263888888888889 | 114.716 |
| 0.7270833333333333 | 110.201 |
| 0.7277777777777777 | 110.201 |
| 0.7284722222222223 | 110.201 |
| 0.7291666666666666 | 137.347 |
| 0.7298611111111111 | 146.423 |
| 0.7305555555555556 | 141.884 |
| 0.7312500000000001 | 141.884 |
| 0.7319444444444444 | 141.884 |
| 0.7326388888888888 | 141.884 |
| 0.7333333333333334 | 141.884 |
| 0.7340277777777778 | 141.884 |
| 0.7347222222222222 | 141.884 |
| 0.7354166666666666 | 137.347 |
| 0.7361111111111112 | 105.69 |
| 0.7368055555555556 | 96.682 |
| 0.7374999999999999 | 92.184 |
| 0.7381944444444444 | 87.692 |
| 0.7388888888888889 | 87.692 |
| 0.7395833333333334 | 87.692 |
| 0.7402777777777777 | 119.235 |
| 0.7409722222222223 | 87.692 |
| 0.7416666666666667 | 83.205 |
| 0.7423611111111111 | 78.722 |
| 0.7430555555555555 | 78.722 |
| 0.74375 | 78.722 |
| 0.7444444444444445 | 92.184 |
| 0.7451388888888889 | 101.184 |
| 0.7458333333333332 | 101.184 |
| 0.7465277777777778 | 83.205 |
| 0.7472222222222222 | 74.246 |
| 0.7479166666666667 | 74.246 |
| 0.748611111111111 | 69.775 |
| 0.7493055555555556 | 69.775 |
| 0.75 | 69.775 |
| 0.7506944444444444 | 69.775 |
| 0.751388888888889 | 69.775 |
| 0.7520833333333333 | 69.775 |
| 0.7527777777777778 | 69.775 |
| 0.7534722222222222 | 96.682 |
| 0.7541666666666668 | 101.184 |
| 0.7548611111111111 | 101.184 |
| 0.7555555555555555 | 96.682 |
| 0.75625 | 101.184 |
| 0.7569444444444445 | 101.184 |
| 0.7576388888888889 | 96.682 |
| 0.7583333333333333 | 96.682 |
| 0.7590277777777777 | 96.682 |
| 0.7597222222222223 | 96.682 |
| 0.7604166666666666 | 92.184 |
| 0.7611111111111111 | 92.184 |
| 0.7618055555555556 | 92.184 |
| 0.7625000000000001 | 92.184 |
| 0.7631944444444444 | 83.205 |
| 0.7638888888888888 | 87.692 |
| 0.7645833333333334 | 83.205 |
| 0.7652777777777778 | 87.692 |
| 0.7659722222222222 | 83.205 |
| 0.7666666666666666 | 83.205 |
| 0.7673611111111112 | 83.205 |
| 0.7680555555555556 | 83.205 |
| 0.7687499999999999 | 83.205 |
| 0.7694444444444444 | 83.205 |
| 0.7701388888888889 | 83.205 |
| 0.7708333333333334 | 78.722 |
| 0.7715277777777777 | 78.722 |
| 0.7722222222222223 | 83.205 |
| 0.7729166666666667 | 78.722 |
| 0.7736111111111111 | 78.722 |
| 0.7743055555555555 | 78.722 |
| 0.775 | 65.31 |
| 0.7756944444444445 | 74.246 |
| 0.7763888888888889 | 69.775 |
| 0.7770833333333332 | 69.775 |
| 0.7777777777777778 | 69.775 |
| 0.7784722222222222 | 69.775 |
| 0.7791666666666667 | 69.775 |
| 0.779861111111111 | 69.775 |
| 0.7805555555555556 | 69.775 |
| 0.78125 | 65.31 |
| 0.7819444444444444 | 65.31 |
| 0.782638888888889 | 60.85 |
| 0.7833333333333333 | 51.951 |
| 0.7840277777777778 | 47.511 |
| 0.7847222222222222 | 47.511 |
| 0.7854166666666668 | 47.511 |
| 0.7861111111111111 | 47.511 |
| 0.7868055555555555 | 47.511 |
| 0.7875 | 47.511 |
| 0.7881944444444445 | 47.511 |
| 0.7888888888888889 | 47.511 |
| 0.7895833333333333 | 43.079 |
| 0.7902777777777777 | 43.079 |
| 0.7909722222222223 | 43.079 |
| 0.7916666666666666 | 43.079 |
| 0.7923611111111111 | 43.079 |
| 0.7930555555555556 | 43.079 |
| 0.7937500000000001 | 43.079 |
| 0.7944444444444444 | 43.079 |
| 0.7951388888888888 | 38.653 |
| 0.7958333333333334 | 38.653 |
| 0.7965277777777778 | 38.653 |
| 0.7972222222222222 | 38.653 |
| 0.7979166666666666 | 34.234 |
| 0.7986111111111112 | 34.234 |
| 0.7993055555555556 | 34.234 |
| 0.7999999999999999 | 29.823 |
| 0.8006944444444444 | 29.823 |
| 0.8013888888888889 | 29.823 |
| 0.8020833333333334 | 29.823 |
| 0.8027777777777777 | 29.823 |
| 0.8034722222222223 | 25.419 |
| 0.8041666666666667 | 25.419 |
| 0.8048611111111111 | 25.419 |
| 0.8055555555555555 | 25.419 |
| 0.80625 | 25.419 |
| 0.8069444444444445 | 25.419 |
| 0.8076388888888889 | 25.419 |
| 0.8083333333333332 | 25.419 |
| 0.8090277777777778 | 25.419 |
| 0.8097222222222222 | 21.024 |
| 0.8104166666666667 | 21.024 |
| 0.811111111111111 | 21.024 |
| 0.8118055555555556 | 21.024 |
| 0.8125 | 21.024 |
| 0.8131944444444444 | 21.024 |
| 0.813888888888889 | 21.024 |
| 0.8145833333333333 | 21.024 |
| 0.8152777777777778 | 16.636 |
| 0.8159722222222222 | 21.024 |
| 0.8166666666666668 | 16.636 |
| 0.8173611111111111 | 16.636 |
| 0.8180555555555555 | 16.636 |
| 0.81875 | 16.636 |
| 0.8194444444444445 | 16.636 |
| 0.8201388888888889 | 16.636 |
| 0.8208333333333333 | 16.636 |
| 0.8215277777777777 | 12.257 |
| 0.8222222222222223 | 12.257 |
| 0.8229166666666666 | 12.257 |
| 0.8236111111111111 | 12.257 |
| 0.8243055555555556 | 12.257 |
| 0.8250000000000001 | 12.257 |
| 0.8256944444444444 | 7.887 |
| 0.8263888888888888 | 12.257 |
| 0.8270833333333334 | 7.887 |
| 0.8277777777777778 | 7.887 |
| 0.8284722222222222 | 7.887 |
| 0.8291666666666666 | 7.887 |
| 0.8298611111111112 | 7.887 |
| 0.8305555555555556 | 7.887 |
| 0.8312499999999999 | 7.887 |
| 0.8319444444444444 | 7.887 |
| 0.8326388888888889 | 3.525 |
| 0.8333333333333334 | 3.525 |
| 0.8340277777777777 | 3.525 |
| 0.8347222222222223 | 3.525 |
| 0.8354166666666667 | 3.525 |
| 0.8361111111111111 | 3.525 |
| 0.8368055555555555 | 3.525 |
| 0.8375 | 3.525 |
| 0.8381944444444445 | 3.525 |
| 0.8388888888888889 | 3.525 |
| 0.8395833333333332 | 3.525 |
| 0.8402777777777778 | 3.525 |
| 0.8409722222222222 | 3.525 |
| 0.8416666666666667 | 3.525 |
| 0.842361111111111 | 3.525 |
| 0.8430555555555556 | 3.525 |
| 0.84375 | 3.525 |
| 0.8444444444444444 | 3.525 |
| 0.845138888888889 | 0 |
| 0.8458333333333333 | 0 |
| 0.8465277777777778 | 0 |
| 0.8472222222222222 | 0 |
| 0.8479166666666668 | 0 |
| 0.8486111111111111 | 0 |
| 0.8493055555555555 | 0 |
| 0.85 | 0 |
| 0.8506944444444445 | 0 |
| 0.8513888888888889 | 0 |
| 0.8520833333333333 | 0 |
| 0.8527777777777777 | 0 |
| 0.8534722222222223 | 0 |
| 0.8541666666666666 | 0 |
| 0.8548611111111111 | 0 |
| 0.8555555555555556 | 0 |
| 0.8562500000000001 | 0 |
| 0.8569444444444444 | 0 |
| 0.8576388888888888 | 0 |
| 0.8583333333333334 | 0 |
| 0.8590277777777778 | 0 |
| 0.8597222222222222 | 0 |
| 0.8604166666666666 | 0 |
| 0.8611111111111112 | 0 |
| 0.8618055555555556 | 0 |
| 0.8624999999999999 | 0 |
| 0.8631944444444444 | 0 |
| 0.8638888888888889 | 0 |
| 0.8645833333333334 | 0 |
| 0.8652777777777777 | 0 |
| 0.8659722222222223 | 0 |
| 0.8666666666666667 | 0 |
| 0.8673611111111111 | 0 |
| 0.8680555555555555 | 0 |
| 0.86875 | 0 |
| 0.8694444444444445 | 0 |
| 0.8701388888888889 | 0 |
| 0.8708333333333332 | 0 |
| 0.8715277777777778 | 0 |
| 0.8722222222222222 | 0 |
| 0.8729166666666667 | 0 |
| 0.873611111111111 | 0 |
| 0.8743055555555556 | 0 |
| 0.875 | 0 |
| 0.8756944444444444 | 0 |
| 0.876388888888889 | 0 |
| 0.8770833333333333 | 0 |
| 0.8777777777777778 | 0 |
| 0.8784722222222222 | 0 |
| 0.8791666666666668 | 0 |
| 0.8798611111111111 | 0 |
| 0.8805555555555555 | 0 |
| 0.88125 | 0 |
| 0.8819444444444445 | 0 |
| 0.8826388888888889 | 0 |
| 0.8833333333333333 | 0 |
| 0.8840277777777777 | 0 |
| 0.8847222222222223 | 0 |
| 0.8854166666666666 | 0 |
| 0.8861111111111111 | 0 |
| 0.8868055555555556 | 0 |
| 0.8875000000000001 | 0 |
| 0.8881944444444444 | 0 |
| 0.8888888888888888 | 0 |
| 0.8895833333333334 | 0 |
| 0.8902777777777778 | 0 |
| 0.8909722222222222 | 0 |
| 0.8916666666666666 | 0 |
| 0.8923611111111112 | 0 |
| 0.8930555555555556 | 0 |
| 0.8937499999999999 | 0 |
| 0.8944444444444444 | 0 |
| 0.8951388888888889 | 0 |
| 0.8958333333333334 | 0 |
| 0.8965277777777777 | 0 |
| 0.8972222222222223 | 0 |
| 0.8979166666666667 | 0 |
| 0.8986111111111111 | 0 |
| 0.8993055555555555 | 0 |
| 0.9 | 0 |
| 0.9006944444444445 | 0 |
| 0.9013888888888889 | 0 |
| 0.9020833333333332 | 0 |
| 0.9027777777777778 | 0 |
| 0.9034722222222222 | 0 |
| 0.9041666666666667 | 0 |
| 0.904861111111111 | 0 |
| 0.9055555555555556 | 0 |
| 0.90625 | 0 |
| 0.9069444444444444 | 0 |
| 0.907638888888889 | 0 |
| 0.9083333333333333 | 0 |
| 0.9090277777777778 | 0 |
| 0.9097222222222222 | 0 |
| 0.9104166666666668 | 0 |
| 0.9111111111111111 | 0 |
| 0.9118055555555555 | 0 |
| 0.9125 | 0 |
| 0.9131944444444445 | 0 |
| 0.9138888888888889 | 0 |
| 0.9145833333333333 | 0 |
| 0.9152777777777777 | 0 |
| 0.9159722222222223 | 0 |
| 0.9166666666666666 | 0 |
| 0.9173611111111111 | 0 |
| 0.9180555555555556 | 0 |
| 0.9187500000000001 | 0 |
| 0.9194444444444444 | 0 |
| 0.9201388888888888 | 0 |
| 0.9208333333333334 | 0 |
| 0.9215277777777778 | 0 |
| 0.9222222222222222 | 0 |
| 0.9229166666666666 | 0 |
| 0.9236111111111112 | 0 |
| 0.9243055555555556 | 0 |
| 0.9249999999999999 | 0 |
| 0.9256944444444444 | 0 |
| 0.9263888888888889 | 0 |
| 0.9270833333333334 | 0 |
| 0.9277777777777777 | 0 |
| 0.9284722222222223 | 0 |
| 0.9291666666666667 | 0 |
| 0.9298611111111111 | 0 |
| 0.9305555555555555 | 0 |
| 0.93125 | 0 |
| 0.9319444444444445 | 0 |
| 0.9326388888888889 | 0 |
| 0.9333333333333332 | 0 |
| 0.9340277777777778 | 0 |
| 0.9347222222222222 | 0 |
| 0.9354166666666667 | 0 |
| 0.936111111111111 | 0 |
| 0.9368055555555556 | 0 |
| 0.9375 | 0 |
| 0.9381944444444444 | 0 |
| 0.938888888888889 | 0 |
| 0.9395833333333333 | 0 |
| 0.9402777777777778 | 0 |
| 0.9409722222222222 | 0 |
| 0.9416666666666668 | 0 |
| 0.9423611111111111 | 0 |
| 0.9430555555555555 | 0 |
| 0.94375 | 0 |
| 0.9444444444444445 | 0 |
| 0.9451388888888889 | 0 |
| 0.9458333333333333 | 0 |
| 0.9465277777777777 | 0 |
| 0.9472222222222223 | 0 |
| 0.9479166666666666 | 0 |
| 0.9486111111111111 | 0 |
| 0.9493055555555556 | 0 |
| 0.9500000000000001 | 0 |
| 0.9506944444444444 | 0 |
| 0.9513888888888888 | 0 |
| 0.9520833333333334 | 0 |
| 0.9527777777777778 | 0 |
| 0.9534722222222222 | 0 |
| 0.9541666666666666 | 0 |
| 0.9548611111111112 | 0 |
| 0.9555555555555556 | 0 |
| 0.9562499999999999 | 0 |
| 0.9569444444444444 | 0 |
| 0.9576388888888889 | 0 |
| 0.9583333333333334 | 0 |
| 0.9590277777777777 | 0 |
| 0.9597222222222223 | 0 |
| 0.9604166666666667 | 0 |
| 0.9611111111111111 | 0 |
| 0.9618055555555555 | 0 |
| 0.9625 | 0 |
| 0.9631944444444445 | 0 |
| 0.9638888888888889 | 0 |
| 0.9645833333333332 | 0 |
| 0.9652777777777778 | 0 |
| 0.9659722222222222 | 0 |
| 0.9666666666666667 | 0 |
| 0.967361111111111 | 0 |
| 0.9680555555555556 | 0 |
| 0.96875 | 0 |
| 0.9694444444444444 | 0 |
| 0.970138888888889 | 0 |
| 0.9708333333333333 | 0 |
| 0.9715277777777778 | 0 |
| 0.9722222222222222 | 0 |
| 0.9729166666666668 | 0 |
| 0.9736111111111111 | 0 |
| 0.9743055555555555 | 0 |
| 0.975 | 0 |
| 0.9756944444444445 | 0 |
| 0.9763888888888889 | 0 |
| 0.9770833333333333 | 0 |
| 0.9777777777777777 | 0 |
| 0.9784722222222223 | 0 |
| 0.9791666666666666 | 0 |
| 0.9798611111111111 | 0 |
| 0.9805555555555556 | 0 |
| 0.9812500000000001 | 0 |
| 0.9819444444444444 | 0 |
| 0.9826388888888888 | 0 |
| 0.9833333333333334 | 0 |
| 0.9840277777777778 | 0 |
| 0.9847222222222222 | 0 |
| 0.9854166666666666 | 0 |
| 0.9861111111111112 | 0 |
| 0.9868055555555556 | 0 |
| 0.9874999999999999 | 0 |
| 0.9881944444444444 | 0 |
| 0.9888888888888889 | 0 |
| 0.9895833333333334 | 0 |
| 0.9902777777777777 | 0 |
| 0.9909722222222223 | 0 |
| 0.9916666666666667 | 0 |
| 0.9923611111111111 | 0 |
| 0.9930555555555555 | 0 |
| 0.99375 | 0 |
| 0.9944444444444445 | 0 |
| 0.9951388888888889 | 0 |
| 0.9958333333333332 | 0 |
| 0.9965277777777778 | 0 |
| 0.9972222222222222 | 0 |
| 0.9979166666666667 | 0 |
| 0.998611111111111 | 0 |
| 0.9993055555555556 | 0 |